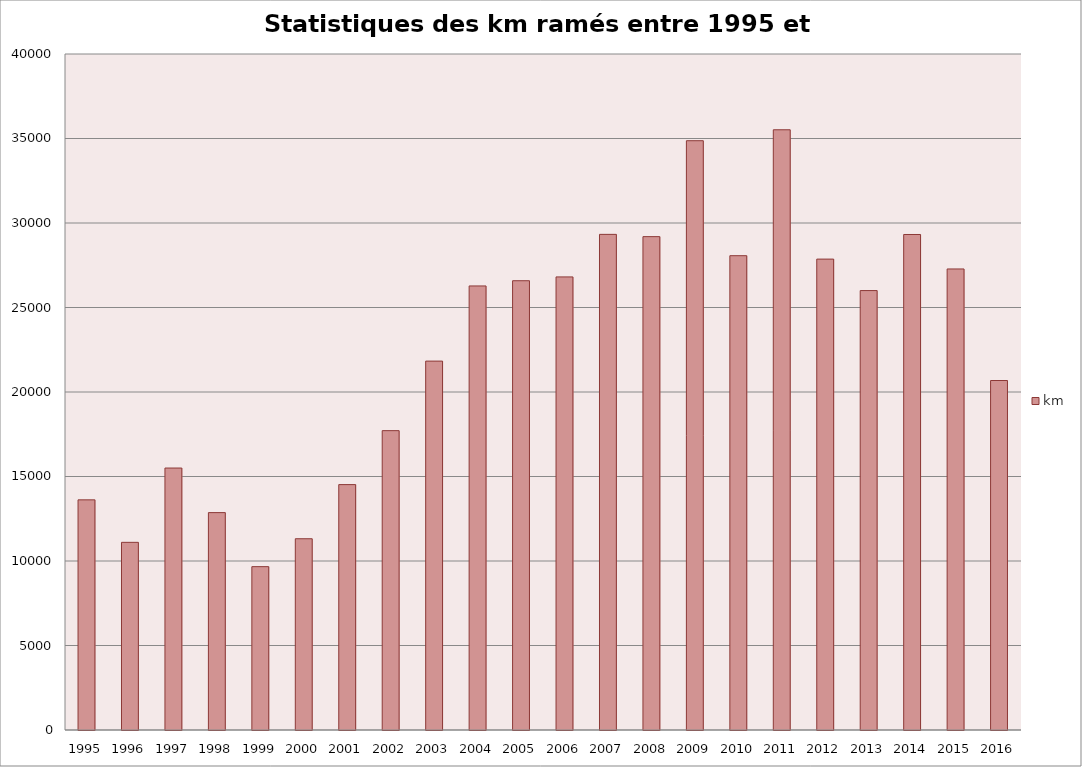
| Category | km |
|---|---|
| 1995.0 | 13618 |
| 1996.0 | 11104 |
| 1997.0 | 15501 |
| 1998.0 | 12863 |
| 1999.0 | 9666 |
| 2000.0 | 11317 |
| 2001.0 | 14521 |
| 2002.0 | 17713 |
| 2003.0 | 21828 |
| 2004.0 | 26275 |
| 2005.0 | 26584 |
| 2006.0 | 26810 |
| 2007.0 | 29327 |
| 2008.0 | 29193 |
| 2009.0 | 34869 |
| 2010.0 | 28065 |
| 2011.0 | 35516 |
| 2012.0 | 27864 |
| 2013.0 | 26002 |
| 2014.0 | 29320 |
| 2015.0 | 27280 |
| 2016.0 | 20680 |